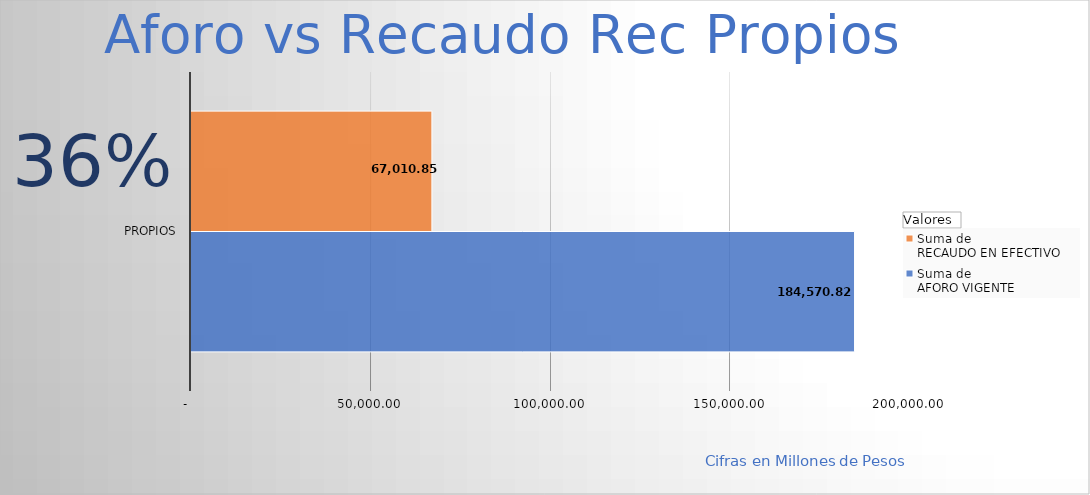
| Category | Suma de 
AFORO VIGENTE
 | Suma de 
RECAUDO EN EFECTIVO 
 |
|---|---|---|
| Propios | 184570.824 | 67010.854 |